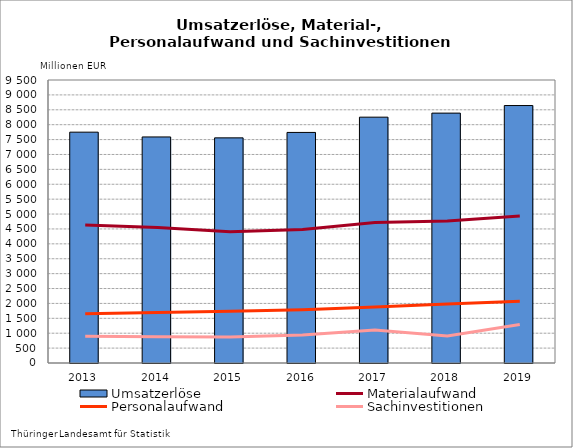
| Category | Umsatzerlöse |
|---|---|
| 2013.0 | 7748.836 |
| 2014.0 | 7588.59 |
| 2015.0 | 7557.268 |
| 2016.0 | 7740.227 |
| 2017.0 | 8252.208 |
| 2018.0 | 8388.485 |
| 2019.0 | 8642.783 |